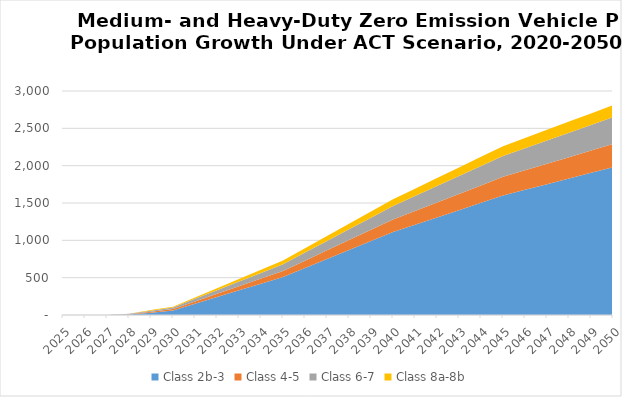
| Category | Class 2b-3 | Class 4-5 | Class 6-7 | Class 8a-8b |
|---|---|---|---|---|
| 2025.0 | 0 | 0 | 0 | 0 |
| 2026.0 | 0 | 0 | 0 | 0 |
| 2027.0 | 0 | 0.412 | 0.448 | 0.259 |
| 2028.0 | 6.9 | 3.893 | 4.446 | 2.59 |
| 2029.0 | 30.841 | 11.83 | 13.483 | 10.316 |
| 2030.0 | 60 | 20 | 20 | 10 |
| 2031.0 | 150 | 32 | 34 | 18 |
| 2032.0 | 240 | 44 | 48 | 26 |
| 2033.0 | 330 | 56 | 62 | 34 |
| 2034.0 | 420 | 68 | 76 | 42 |
| 2035.0 | 510 | 80 | 90 | 50 |
| 2036.0 | 630 | 98 | 108 | 58 |
| 2037.0 | 750 | 116 | 126 | 66 |
| 2038.0 | 870 | 134 | 144 | 74 |
| 2039.0 | 990 | 152 | 162 | 82 |
| 2040.0 | 1110 | 170 | 180 | 90 |
| 2041.0 | 1208 | 186 | 200 | 98 |
| 2042.0 | 1306 | 202 | 220 | 106 |
| 2043.0 | 1404 | 218 | 240 | 114 |
| 2044.0 | 1502 | 234 | 260 | 122 |
| 2045.0 | 1600 | 250 | 280 | 130 |
| 2046.0 | 1676 | 262 | 296 | 136 |
| 2047.0 | 1752 | 274 | 312 | 142 |
| 2048.0 | 1828 | 286 | 328 | 148 |
| 2049.0 | 1904 | 298 | 344 | 154 |
| 2050.0 | 1980 | 310 | 360 | 160 |